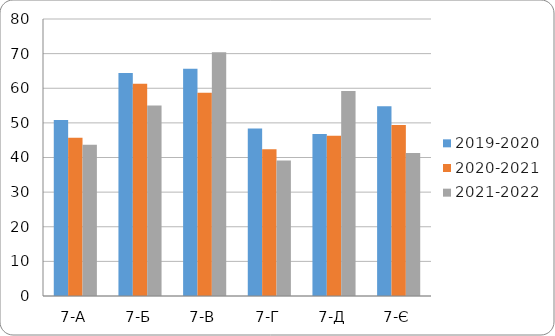
| Category | 2019-2020 | 2020-2021 | 2021-2022 |
|---|---|---|---|
| 7-А | 50.8 | 45.7 | 43.7 |
| 7-Б | 64.4 | 61.3 | 55 |
| 7-В | 65.6 | 58.7 | 70.4 |
| 7-Г | 48.4 | 42.4 | 39.1 |
| 7-Д | 46.8 | 46.3 | 59.2 |
| 7-Є | 54.8 | 49.4 | 41.3 |